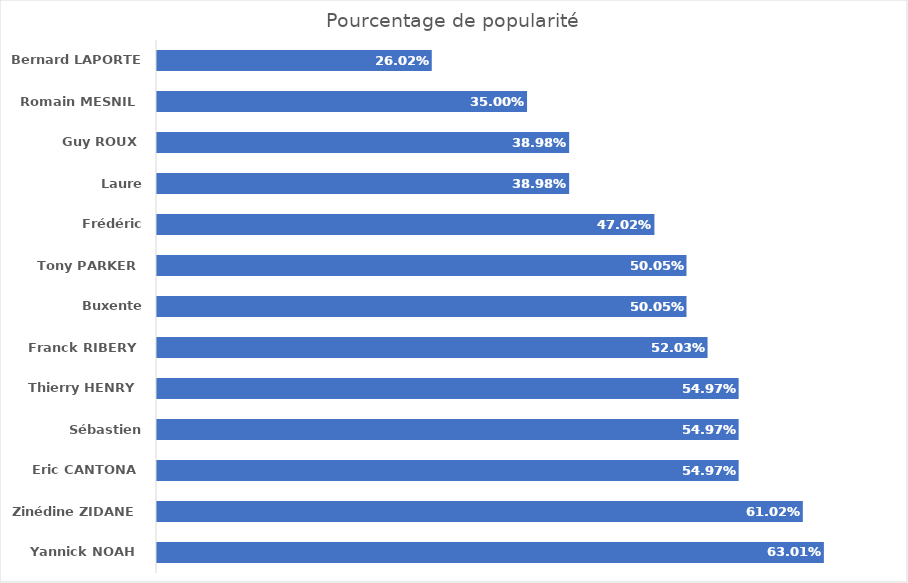
| Category | Series 0 |
|---|---|
| Yannick NOAH | 0.63 |
| Zinédine ZIDANE | 0.61 |
| Eric CANTONA | 0.55 |
| Sébastien CHABAL | 0.55 |
| Thierry HENRY | 0.55 |
| Franck RIBERY | 0.52 |
| Buxente LIZARAZU | 0.5 |
| Tony PARKER | 0.5 |
| Frédéric MICHALAK | 0.47 |
| Laure MANAUDOU | 0.39 |
| Guy ROUX | 0.39 |
| Romain MESNIL | 0.35 |
| Bernard LAPORTE | 0.26 |